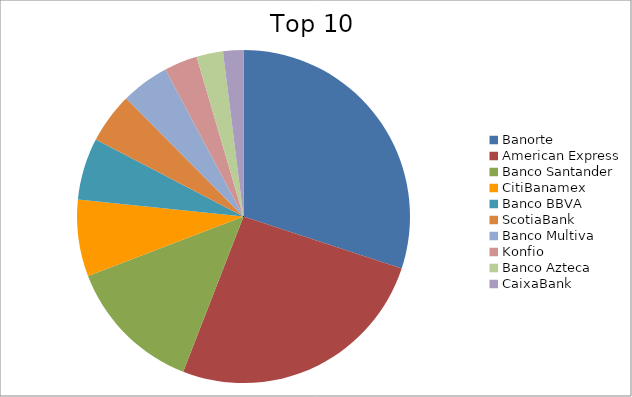
| Category | Series 0 |
|---|---|
| Banorte | 30.06 |
| American Express | 25.84 |
| Banco Santander | 13.28 |
| CitiBanamex | 7.45 |
| Banco BBVA | 6.01 |
| ScotiaBank | 4.91 |
| Banco Multiva | 4.68 |
| Konfio | 3.23 |
| Banco Azteca | 2.57 |
| CaixaBank | 1.97 |